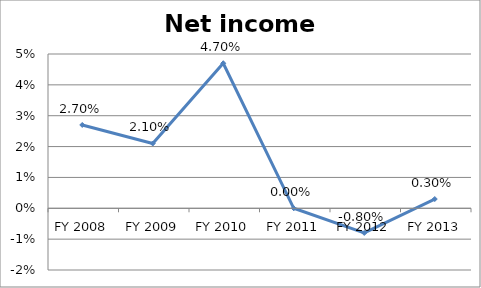
| Category | Net income ratio |
|---|---|
| FY 2013 | 0.003 |
| FY 2012 | -0.008 |
| FY 2011 | 0 |
| FY 2010 | 0.047 |
| FY 2009 | 0.021 |
| FY 2008 | 0.027 |